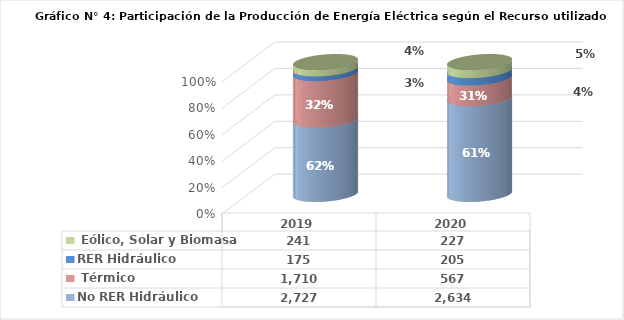
| Category | No RER | RER |
|---|---|---|
| 2019.0 | 1709.624 | 240.944 |
| 2020.0 | 566.627 | 226.882 |